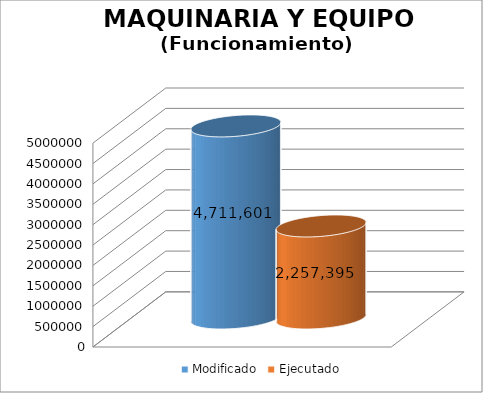
| Category | Modificado | Ejecutado |
|---|---|---|
| 0 | 4711601 | 2257395.02 |